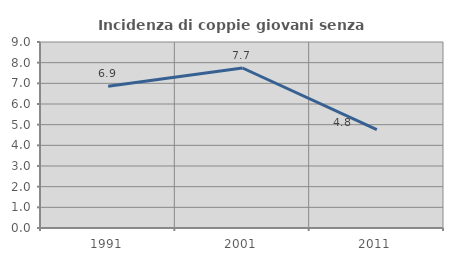
| Category | Incidenza di coppie giovani senza figli |
|---|---|
| 1991.0 | 6.858 |
| 2001.0 | 7.742 |
| 2011.0 | 4.758 |